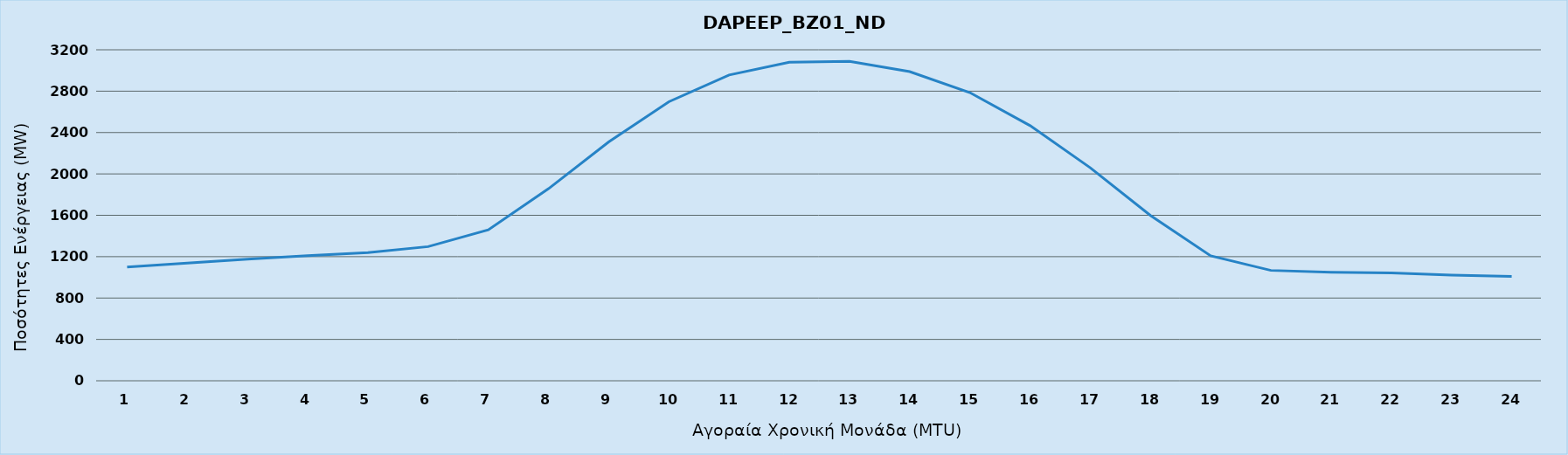
| Category | DAPEEP_BZ01_NDR |
|---|---|
| 0 | 1099 |
| 1 | 1137 |
| 2 | 1175 |
| 3 | 1210 |
| 4 | 1239 |
| 5 | 1297 |
| 6 | 1459 |
| 7 | 1857 |
| 8 | 2309 |
| 9 | 2698 |
| 10 | 2956 |
| 11 | 3080 |
| 12 | 3088 |
| 13 | 2989 |
| 14 | 2786 |
| 15 | 2467 |
| 16 | 2059 |
| 17 | 1598 |
| 18 | 1208 |
| 19 | 1067 |
| 20 | 1049 |
| 21 | 1042 |
| 22 | 1021 |
| 23 | 1009 |